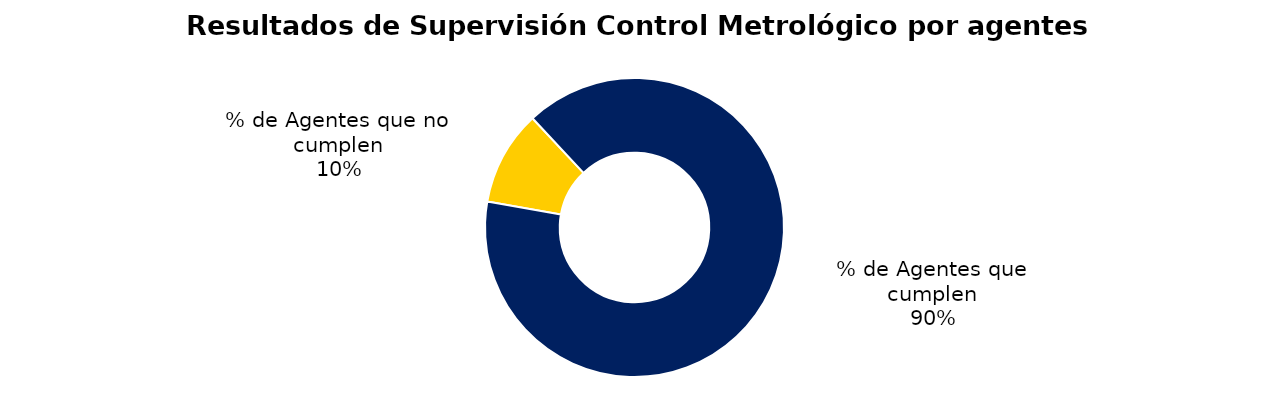
| Category | Series 0 |
|---|---|
| % de Agentes que no cumplen | 42 |
| % de Agentes que cumplen | 367 |